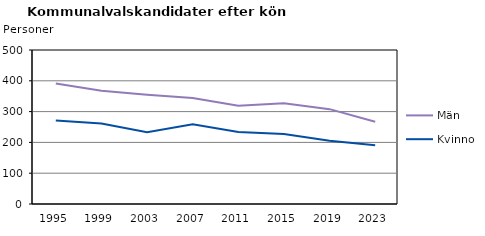
| Category | Män | Kvinnor |
|---|---|---|
| 1995.0 | 391 | 271 |
| 1999.0 | 368 | 261 |
| 2003.0 | 355 | 233 |
| 2007.0 | 344 | 259 |
| 2011.0 | 319 | 234 |
| 2015.0 | 327 | 227 |
| 2019.0 | 308 | 205 |
| 2023.0 | 267 | 191 |